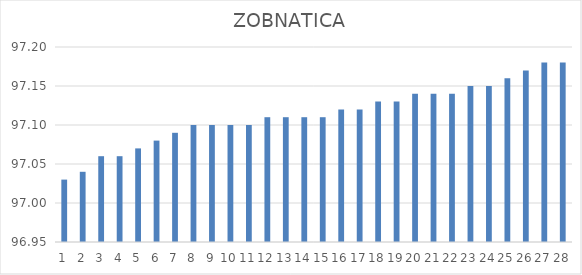
| Category | ZOBNATICA |
|---|---|
| 0 | 97.03 |
| 1 | 97.04 |
| 2 | 97.06 |
| 3 | 97.06 |
| 4 | 97.07 |
| 5 | 97.08 |
| 6 | 97.09 |
| 7 | 97.1 |
| 8 | 97.1 |
| 9 | 97.1 |
| 10 | 97.1 |
| 11 | 97.11 |
| 12 | 97.11 |
| 13 | 97.11 |
| 14 | 97.11 |
| 15 | 97.12 |
| 16 | 97.12 |
| 17 | 97.13 |
| 18 | 97.13 |
| 19 | 97.14 |
| 20 | 97.14 |
| 21 | 97.14 |
| 22 | 97.15 |
| 23 | 97.15 |
| 24 | 97.16 |
| 25 | 97.17 |
| 26 | 97.18 |
| 27 | 97.18 |